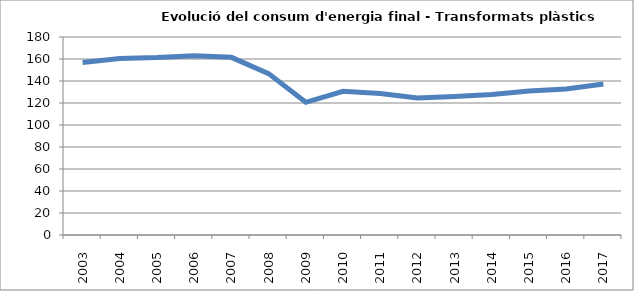
| Category | 156,9 160,5 161,3 162,9 161,5 146,7 120,6 130,6 128,7 124,6 125,8 127,7 130,9 132,7 137,3 |
|---|---|
| 2003.0 | 156.9 |
| 2004.0 | 160.5 |
| 2005.0 | 161.3 |
| 2006.0 | 162.9 |
| 2007.0 | 161.5 |
| 2008.0 | 146.7 |
| 2009.0 | 120.6 |
| 2010.0 | 130.6 |
| 2011.0 | 128.7 |
| 2012.0 | 124.6 |
| 2013.0 | 125.8 |
| 2014.0 | 127.7 |
| 2015.0 | 130.9 |
| 2016.0 | 132.7 |
| 2017.0 | 137.3 |